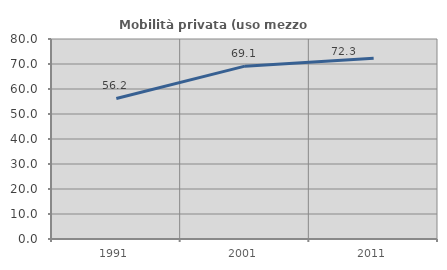
| Category | Mobilità privata (uso mezzo privato) |
|---|---|
| 1991.0 | 56.218 |
| 2001.0 | 69.143 |
| 2011.0 | 72.316 |